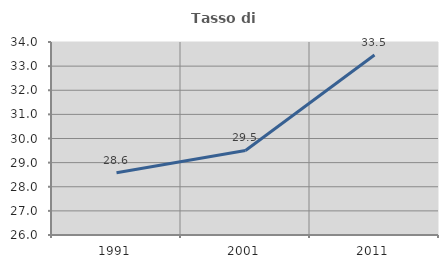
| Category | Tasso di occupazione   |
|---|---|
| 1991.0 | 28.582 |
| 2001.0 | 29.505 |
| 2011.0 | 33.463 |